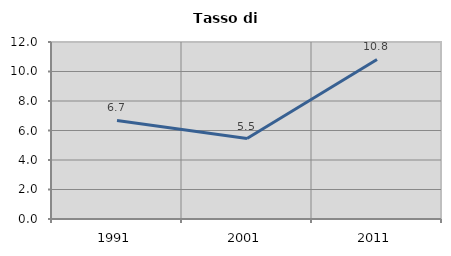
| Category | Tasso di disoccupazione   |
|---|---|
| 1991.0 | 6.68 |
| 2001.0 | 5.455 |
| 2011.0 | 10.816 |